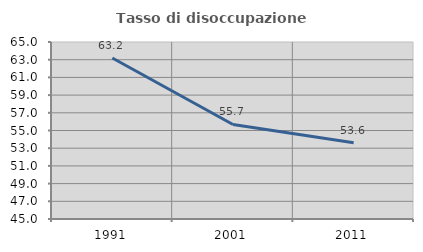
| Category | Tasso di disoccupazione giovanile  |
|---|---|
| 1991.0 | 63.187 |
| 2001.0 | 55.682 |
| 2011.0 | 53.608 |